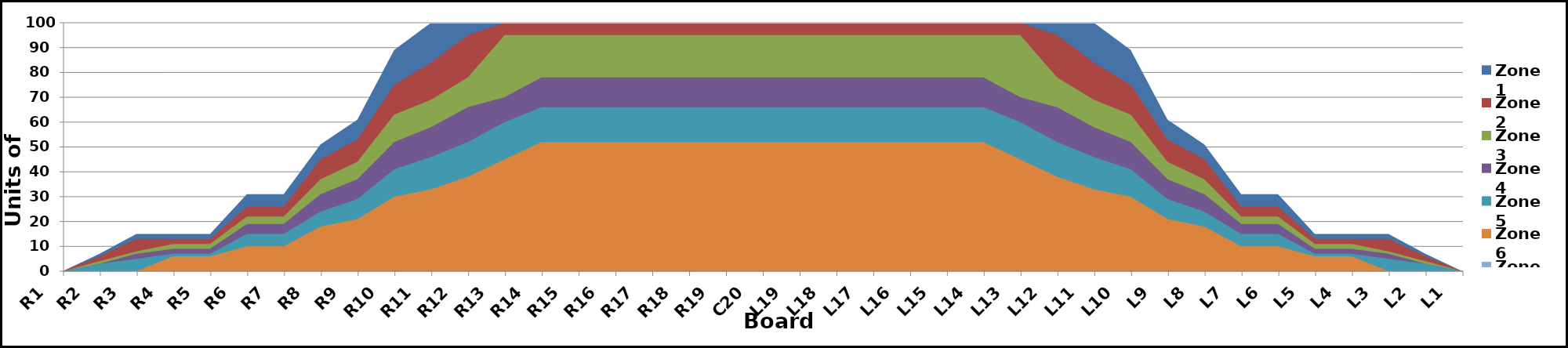
| Category | Zone 1 | Zone 2 | Zone 3 | Zone 4 | Zone 5 | Zone 6 | Zone 7 | Zone 8 |
|---|---|---|---|---|---|---|---|---|
| L1 | 0 | 0 | 0 | 0 | 0 | 0 | 0 |  |
| L2 | 7 | 6 | 4 | 3 | 3 | 0 | 0 |  |
| L3 | 15 | 13 | 8 | 7 | 5 | 0 | 0 |  |
| L4 | 15 | 13 | 11 | 9 | 7 | 6 | 0 |  |
| L5 | 15 | 13 | 11 | 9 | 7 | 6 | 0 |  |
| L6 | 31 | 26 | 22 | 19 | 15 | 10 | 0 |  |
| L7 | 31 | 26 | 22 | 19 | 15 | 10 | 0 |  |
| L8 | 51 | 45 | 37 | 31 | 24 | 18 | 0 |  |
| L9 | 61 | 53 | 44 | 37 | 29 | 21 | 0 |  |
| L10 | 89 | 75 | 63 | 52 | 41 | 30 | 0 |  |
| L11 | 100 | 84 | 69 | 58 | 46 | 33 | 0 |  |
| L12 | 100 | 95 | 78 | 66 | 52 | 38 | 0 |  |
| L13 | 100 | 100 | 95 | 70 | 60 | 45 | 0 |  |
| L14 | 100 | 100 | 95 | 78 | 66 | 52 | 0 |  |
| L15 | 100 | 100 | 95 | 78 | 66 | 52 | 0 |  |
| L16 | 100 | 100 | 95 | 78 | 66 | 52 | 0 |  |
| L17 | 100 | 100 | 95 | 78 | 66 | 52 | 0 |  |
| L18 | 100 | 100 | 95 | 78 | 66 | 52 | 0 |  |
| L19 | 100 | 100 | 95 | 78 | 66 | 52 | 0 |  |
| C20 | 100 | 100 | 95 | 78 | 66 | 52 | 0 |  |
| R19 | 100 | 100 | 95 | 78 | 66 | 52 | 0 |  |
| R18 | 100 | 100 | 95 | 78 | 66 | 52 | 0 |  |
| R17 | 100 | 100 | 95 | 78 | 66 | 52 | 0 |  |
| R16 | 100 | 100 | 95 | 78 | 66 | 52 | 0 |  |
| R15 | 100 | 100 | 95 | 78 | 66 | 52 | 0 |  |
| R14 | 100 | 100 | 95 | 78 | 66 | 52 | 0 |  |
| R13 | 100 | 100 | 95 | 70 | 60 | 45 | 0 |  |
| R12 | 100 | 95 | 78 | 66 | 52 | 38 | 0 |  |
| R11 | 100 | 84 | 69 | 58 | 46 | 33 | 0 |  |
| R10 | 89 | 75 | 63 | 52 | 41 | 30 | 0 |  |
| R9 | 61 | 53 | 44 | 37 | 29 | 21 | 0 |  |
| R8 | 51 | 45 | 37 | 31 | 24 | 18 | 0 |  |
| R7 | 31 | 26 | 22 | 19 | 15 | 10 | 0 |  |
| R6 | 31 | 26 | 22 | 19 | 15 | 10 | 0 |  |
| R5 | 15 | 13 | 11 | 9 | 7 | 6 | 0 |  |
| R4 | 15 | 13 | 11 | 9 | 7 | 6 | 0 |  |
| R3 | 15 | 13 | 8 | 7 | 5 | 0 | 0 |  |
| R2 | 7 | 6 | 4 | 3 | 3 | 0 | 0 |  |
| R1 | 0 | 0 | 0 | 0 | 0 | 0 | 0 |  |